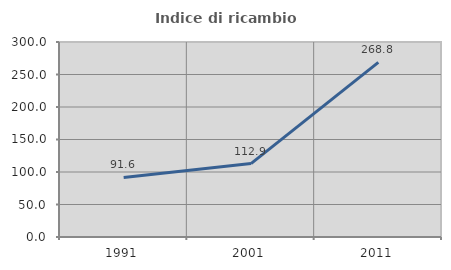
| Category | Indice di ricambio occupazionale  |
|---|---|
| 1991.0 | 91.625 |
| 2001.0 | 112.918 |
| 2011.0 | 268.765 |